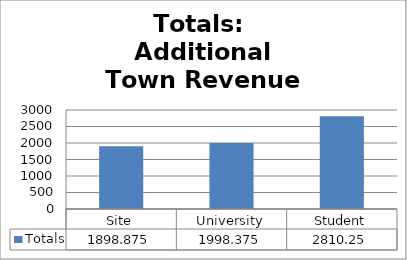
| Category | Totals |
|---|---|
| Site | 1898.875 |
| University | 1998.375 |
| Student | 2810.25 |